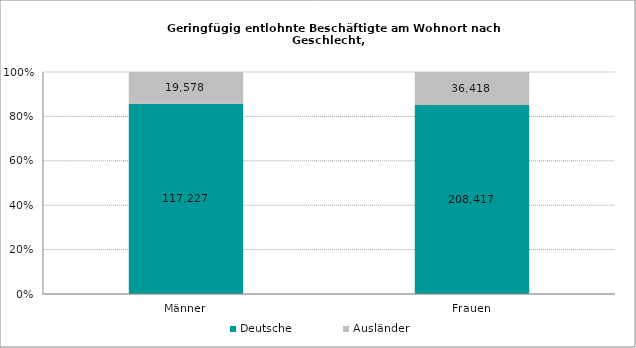
| Category | Deutsche | Ausländer |
|---|---|---|
| Männer | 117227 | 19578 |
| Frauen | 208417 | 36418 |